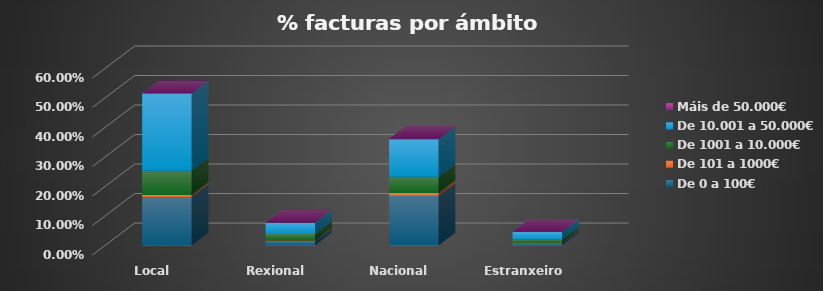
| Category | De 0 a 100€ | De 101 a 1000€ | De 1001 a 10.000€ | De 10.001 a 50.000€ | Máis de 50.000€ |
|---|---|---|---|---|---|
| Local | 0.164 | 0.006 | 0.083 | 0.262 | 0 |
| Rexional | 0.015 | 0.001 | 0.022 | 0.039 | 0 |
| Nacional | 0.167 | 0.01 | 0.055 | 0.127 | 0.002 |
| Estranxeiro | 0.008 | 0.001 | 0.01 | 0.027 | 0 |